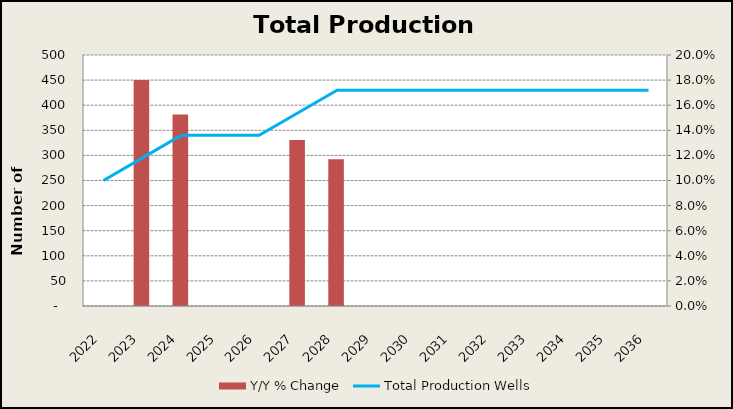
| Category | Y/Y % Change |
|---|---|
| 2022.0 | 0 |
| 2023.0 | 0.18 |
| 2024.0 | 0.153 |
| 2025.0 | 0 |
| 2026.0 | 0 |
| 2027.0 | 0.132 |
| 2028.0 | 0.117 |
| 2029.0 | 0 |
| 2030.0 | 0 |
| 2031.0 | 0 |
| 2032.0 | 0 |
| 2033.0 | 0 |
| 2034.0 | 0 |
| 2035.0 | 0 |
| 2036.0 | 0 |